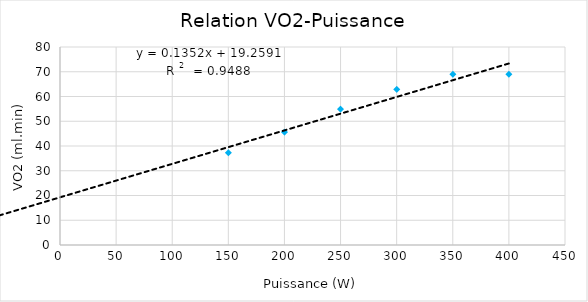
| Category | VO2 (ml.min.kg) |
|---|---|
| 150.0 | 37.288 |
| 200.0 | 45.593 |
| 250.0 | 54.915 |
| 300.0 | 62.881 |
| 350.0 | 68.983 |
| 400.0 | 68.983 |